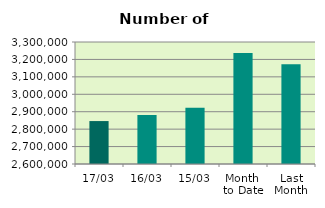
| Category | Series 0 |
|---|---|
| 17/03 | 2846356 |
| 16/03 | 2881134 |
| 15/03 | 2923068 |
| Month 
to Date | 3237602.462 |
| Last
Month | 3172414.4 |